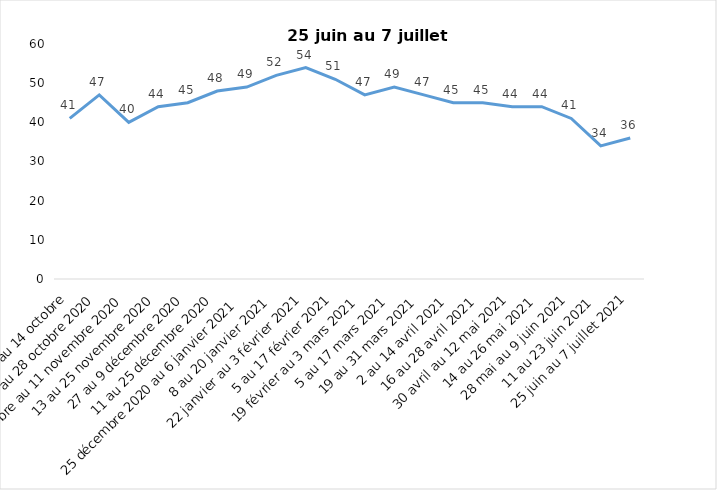
| Category | Toujours aux trois mesures |
|---|---|
| 2 au 14 octobre | 41 |
| 16 au 28 octobre 2020 | 47 |
| 30 octobre au 11 novembre 2020 | 40 |
| 13 au 25 novembre 2020 | 44 |
| 27 au 9 décembre 2020 | 45 |
| 11 au 25 décembre 2020 | 48 |
| 25 décembre 2020 au 6 janvier 2021 | 49 |
| 8 au 20 janvier 2021 | 52 |
| 22 janvier au 3 février 2021 | 54 |
| 5 au 17 février 2021 | 51 |
| 19 février au 3 mars 2021 | 47 |
| 5 au 17 mars 2021 | 49 |
| 19 au 31 mars 2021 | 47 |
| 2 au 14 avril 2021 | 45 |
| 16 au 28 avril 2021 | 45 |
| 30 avril au 12 mai 2021 | 44 |
| 14 au 26 mai 2021 | 44 |
| 28 mai au 9 juin 2021 | 41 |
| 11 au 23 juin 2021 | 34 |
| 25 juin au 7 juillet 2021 | 36 |